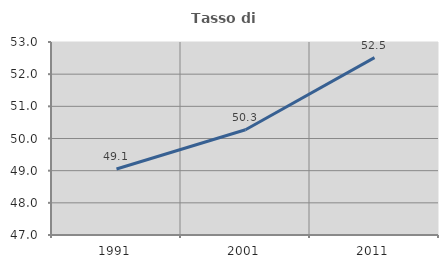
| Category | Tasso di occupazione   |
|---|---|
| 1991.0 | 49.051 |
| 2001.0 | 50.271 |
| 2011.0 | 52.515 |